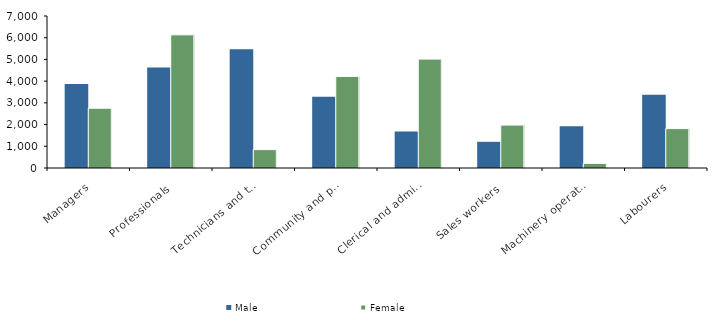
| Category | Male | Female |
|---|---|---|
| Managers | 3868 | 2753 |
| Professionals | 4627 | 6132 |
| Technicians and trades workers | 5466 | 846 |
| Community and personal service workers | 3279 | 4217 |
| Clerical and administrative workers | 1682 | 5015 |
| Sales workers | 1206 | 1976 |
| Machinery operators and drivers | 1920 | 213 |
| Labourers | 3373 | 1814 |